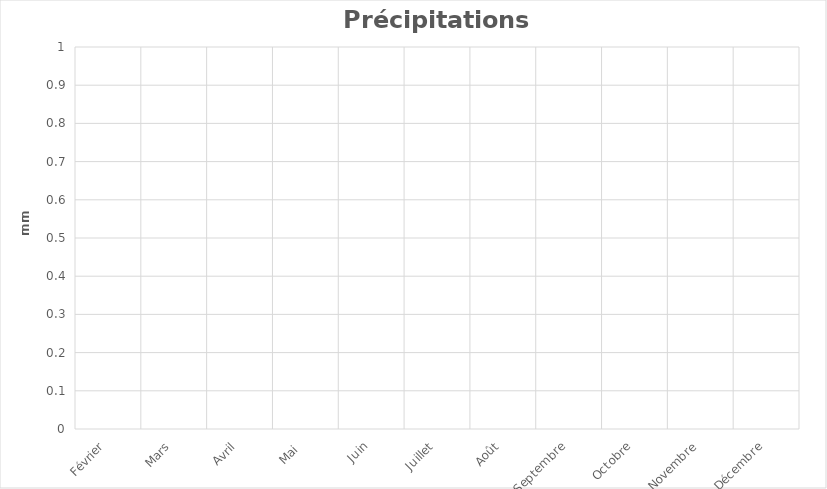
| Category | Series 0 |
|---|---|
| Février | 0 |
| Mars | 0 |
| Avril | 0 |
| Mai  | 0 |
| Juin | 0 |
| Juillet | 0 |
| Août | 0 |
| Septembre | 0 |
| Octobre | 0 |
| Novembre | 0 |
| Décembre | 0 |